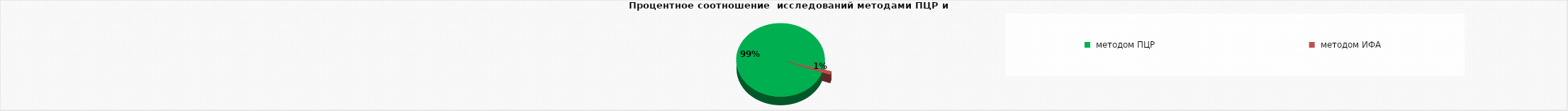
| Category | сыворотка | 1465 |
|---|---|---|
|  методом ПЦР | 1465 |  |
|  методом ИФА | 21 |  |